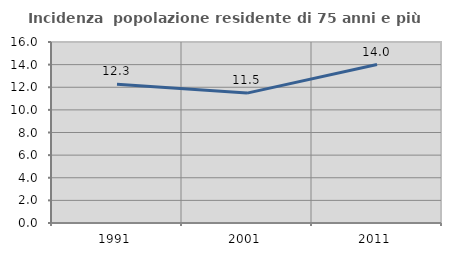
| Category | Incidenza  popolazione residente di 75 anni e più |
|---|---|
| 1991.0 | 12.273 |
| 2001.0 | 11.483 |
| 2011.0 | 14.01 |